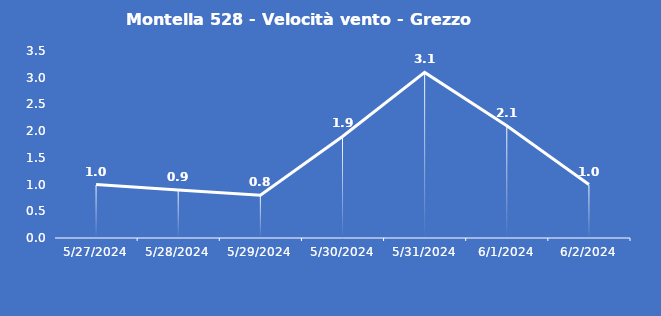
| Category | Montella 528 - Velocità vento - Grezzo (m/s) |
|---|---|
| 5/27/24 | 1 |
| 5/28/24 | 0.9 |
| 5/29/24 | 0.8 |
| 5/30/24 | 1.9 |
| 5/31/24 | 3.1 |
| 6/1/24 | 2.1 |
| 6/2/24 | 1 |